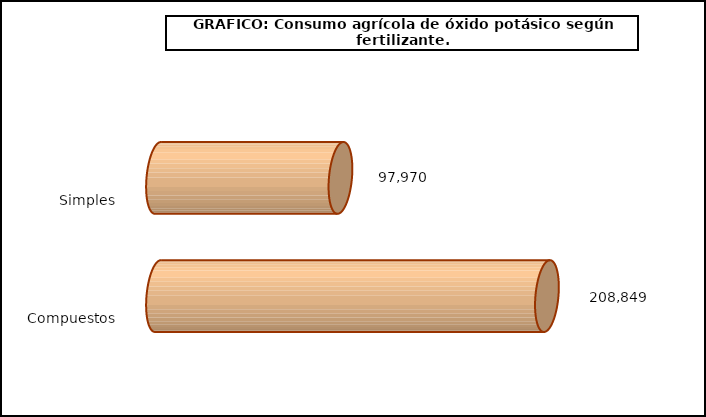
| Category | fert. N |
|---|---|
| 0 | 97970.111 |
| 1 | 208848.516 |